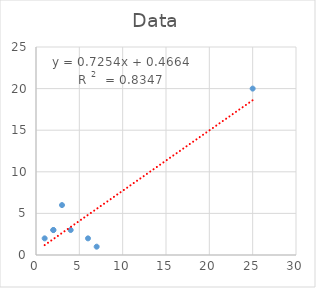
| Category | Series 0 |
|---|---|
| 2.0 | 3 |
| 4.0 | 3 |
| 3.0 | 6 |
| 6.0 | 2 |
| 25.0 | 20 |
| 2.0 | 3 |
| 7.0 | 1 |
| 1.0 | 2 |